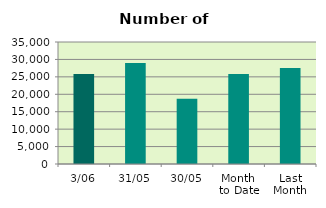
| Category | Series 0 |
|---|---|
| 3/06 | 25832 |
| 31/05 | 29008 |
| 30/05 | 18694 |
| Month 
to Date | 25832 |
| Last
Month | 27522.455 |